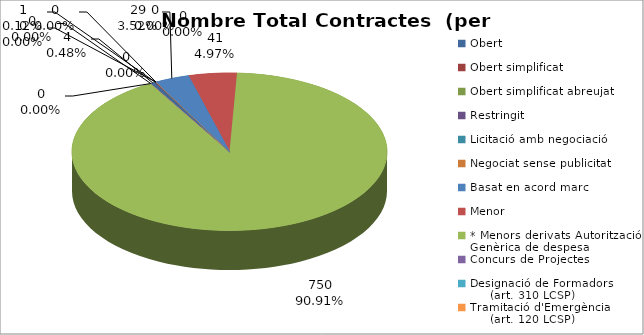
| Category | Nombre Total Contractes |
|---|---|
| Obert | 4 |
| Obert simplificat | 1 |
| Obert simplificat abreujat | 0 |
| Restringit | 0 |
| Licitació amb negociació | 0 |
| Negociat sense publicitat | 0 |
| Basat en acord marc | 29 |
| Menor | 41 |
| * Menors derivats Autorització Genèrica de despesa | 750 |
| Concurs de Projectes | 0 |
| Designació de Formadors
     (art. 310 LCSP) | 0 |
| Tramitació d'Emergència
     (art. 120 LCSP) | 0 |